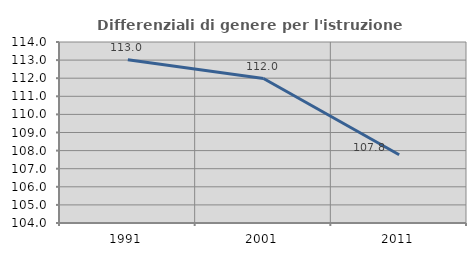
| Category | Differenziali di genere per l'istruzione superiore |
|---|---|
| 1991.0 | 113.014 |
| 2001.0 | 111.981 |
| 2011.0 | 107.774 |